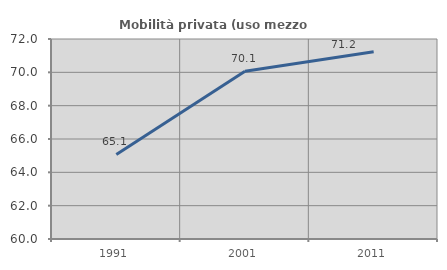
| Category | Mobilità privata (uso mezzo privato) |
|---|---|
| 1991.0 | 65.07 |
| 2001.0 | 70.071 |
| 2011.0 | 71.235 |